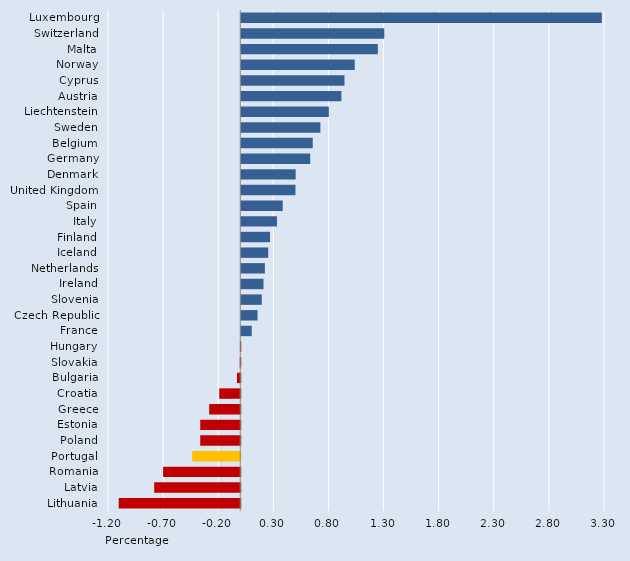
| Category | Series 0 |
|---|---|
| Luxembourg | 3.271 |
| Switzerland | 1.298 |
| Malta | 1.239 |
| Norway | 1.03 |
| Cyprus | 0.937 |
| Austria | 0.908 |
| Liechtenstein | 0.795 |
| Sweden | 0.718 |
| Belgium | 0.648 |
| Germany | 0.626 |
| Denmark | 0.493 |
| United Kingdom | 0.492 |
| Spain | 0.376 |
| Italy | 0.324 |
| Finland | 0.261 |
| Iceland | 0.244 |
| Netherlands | 0.214 |
| Ireland | 0.202 |
| Slovenia | 0.186 |
| Czech Republic | 0.148 |
| France | 0.095 |
| Hungary | -0.003 |
| Slovakia | -0.005 |
| Bulgaria | -0.03 |
| Croatia | -0.191 |
| Greece | -0.282 |
| Estonia | -0.363 |
| Poland | -0.363 |
| Portugal | -0.436 |
| Romania | -0.7 |
| Latvia | -0.781 |
| Lithuania | -1.103 |